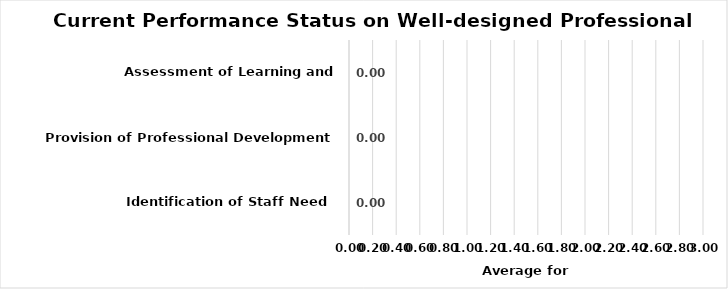
| Category | Current Performance Status on
Well-designed Professional Development |
|---|---|
| Identification of Staff Need | 0 |
| Provision of Professional Development Supports | 0 |
| Assessment of Learning and Implementation | 0 |